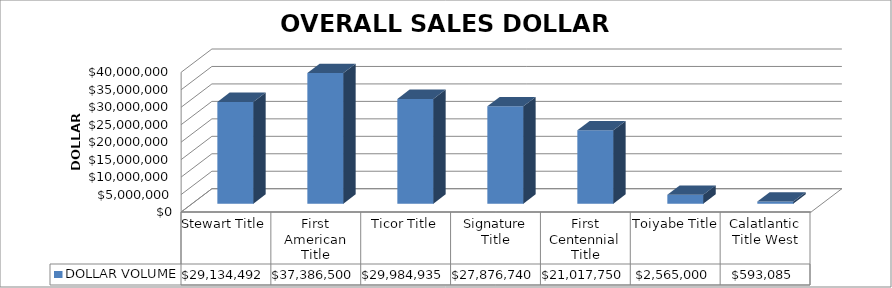
| Category | DOLLAR VOLUME |
|---|---|
| Stewart Title | 29134492.4 |
| First American Title | 37386500 |
| Ticor Title | 29984935 |
| Signature Title | 27876740 |
| First Centennial Title | 21017750 |
| Toiyabe Title | 2565000 |
| Calatlantic Title West | 593085 |